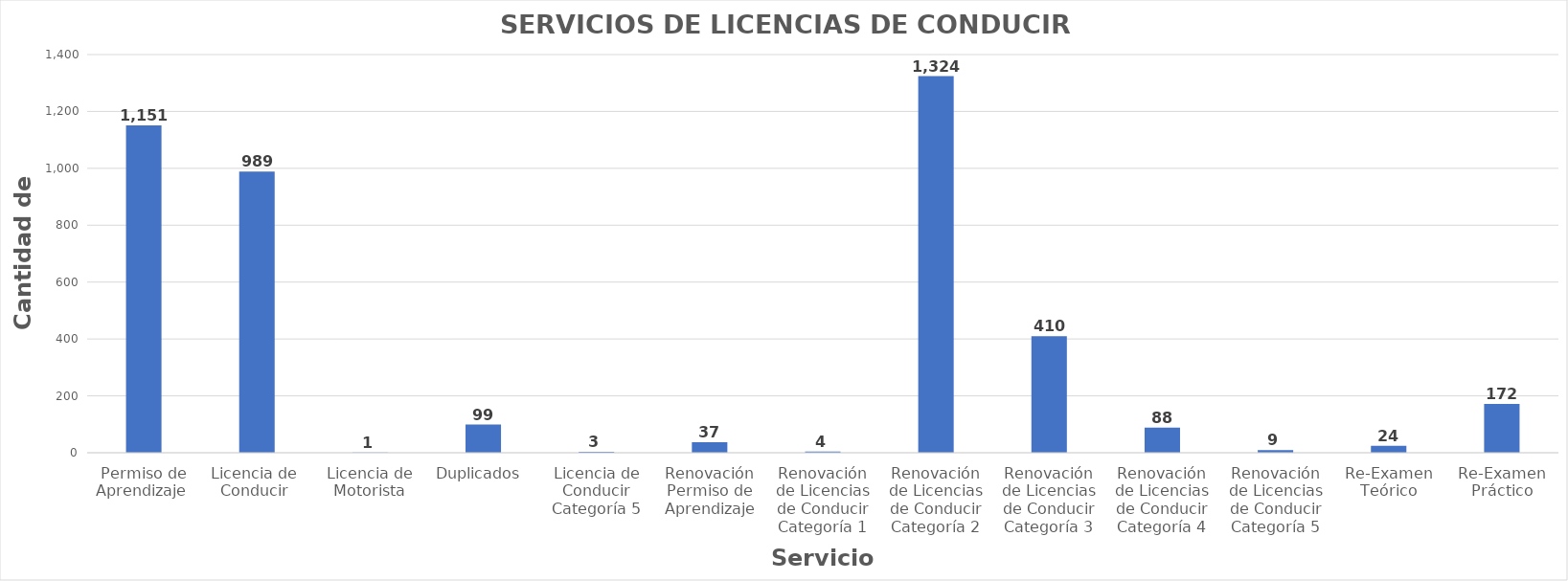
| Category | Series 0 |
|---|---|
| Permiso de Aprendizaje  | 1151 |
| Licencia de  Conducir  | 989 |
| Licencia de Motorista | 1 |
| Duplicados  | 99 |
| Licencia de Conducir Categoría 5 | 3 |
| Renovación Permiso de Aprendizaje | 37 |
| Renovación de Licencias de Conducir Categoría 1 | 4 |
| Renovación de Licencias de Conducir Categoría 2 | 1324 |
| Renovación de Licencias de Conducir Categoría 3 | 410 |
| Renovación de Licencias de Conducir Categoría 4 | 88 |
| Renovación de Licencias de Conducir Categoría 5 | 9 |
| Re-Examen Teórico | 24 |
| Re-Examen Práctico | 172 |